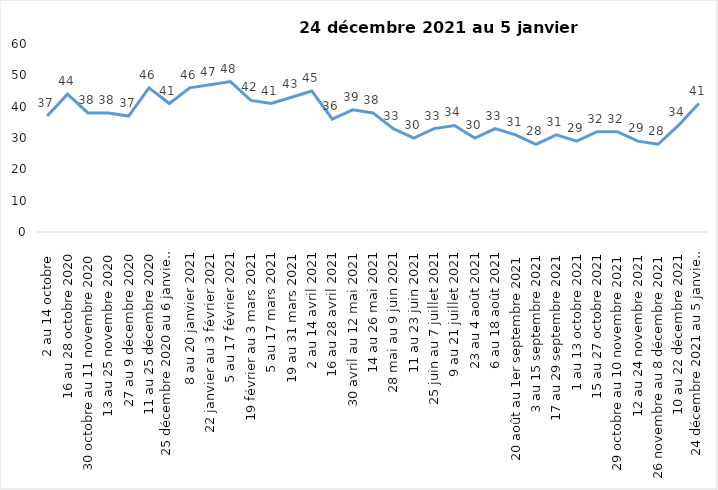
| Category | Toujours aux trois mesures |
|---|---|
| 2 au 14 octobre  | 37 |
| 16 au 28 octobre 2020 | 44 |
| 30 octobre au 11 novembre 2020 | 38 |
| 13 au 25 novembre 2020 | 38 |
| 27 au 9 décembre 2020 | 37 |
| 11 au 25 décembre 2020 | 46 |
| 25 décembre 2020 au 6 janvier 2021 | 41 |
| 8 au 20 janvier 2021 | 46 |
| 22 janvier au 3 février 2021 | 47 |
| 5 au 17 février 2021 | 48 |
| 19 février au 3 mars 2021 | 42 |
| 5 au 17 mars 2021 | 41 |
| 19 au 31 mars 2021 | 43 |
| 2 au 14 avril 2021 | 45 |
| 16 au 28 avril 2021 | 36 |
| 30 avril au 12 mai 2021 | 39 |
| 14 au 26 mai 2021 | 38 |
| 28 mai au 9 juin 2021 | 33 |
| 11 au 23 juin 2021 | 30 |
| 25 juin au 7 juillet 2021 | 33 |
| 9 au 21 juillet 2021 | 34 |
| 23 au 4 août 2021 | 30 |
| 6 au 18 août 2021 | 33 |
| 20 août au 1er septembre 2021 | 31 |
| 3 au 15 septembre 2021 | 28 |
| 17 au 29 septembre 2021 | 31 |
| 1 au 13 octobre 2021 | 29 |
| 15 au 27 octobre 2021 | 32 |
| 29 octobre au 10 novembre 2021 | 32 |
| 12 au 24 novembre 2021 | 29 |
| 26 novembre au 8 décembre 2021 | 28 |
| 10 au 22 décembre 2021 | 34 |
| 24 décembre 2021 au 5 janvier 2022 | 41 |